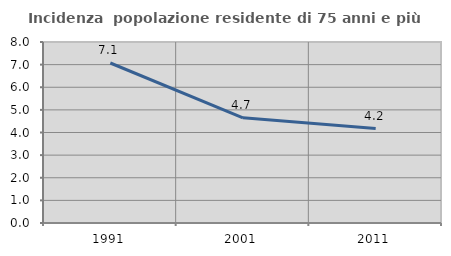
| Category | Incidenza  popolazione residente di 75 anni e più |
|---|---|
| 1991.0 | 7.072 |
| 2001.0 | 4.651 |
| 2011.0 | 4.171 |